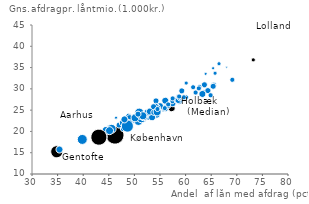
| Category | København Frederiksberg Ballerup Brøndby Dragør Gentofte Gladsaxe Glostrup Herlev Albertslund Hvidovre Høje-Taastrup Lyngby-Taarbæk Rødovre Ishøj Tårnby Vallensbæk Furesø Allerød Fredensborg Helsingør Hillerød Hørsholm Rudersdal Egedal Frederikssund Greve |
|---|---|
| 46.2064292720321 | 19.141 |
| 43.74948794481222 | 18.816 |
| 53.246990490733516 | 24.933 |
| 56.19966291986821 | 25.818 |
| 42.278254790851285 | 19.074 |
| 34.788096925415566 | 15.276 |
| 52.63663149727503 | 23.701 |
| 54.024108417019164 | 24.579 |
| 52.193446699924216 | 24.371 |
| 57.779519547929624 | 26.707 |
| 54.0351104898731 | 23.713 |
| 57.049739228572946 | 26.231 |
| 45.27730023196215 | 20.652 |
| 54.320895299980634 | 23.922 |
| 55.60501067124296 | 25.104 |
| 53.3598359484861 | 23.438 |
| 54.845332667704824 | 25.705 |
| 48.10721754639332 | 22.326 |
| 50.54379972469607 | 23.61 |
| 47.89460088870281 | 22.057 |
| 44.46162168246338 | 20.262 |
| 51.582018004327864 | 24.283 |
| 35.30276949004437 | 15.828 |
| 39.759261127122656 | 18.192 |
| 52.32371686442673 | 24.364 |
| 55.89909777880659 | 25.564 |
| 49.562023551926856 | 22.693 |
| 54.971494579143624 | 25.966 |
| 59.51351144801025 | 28.023 |
| 50.77179942301091 | 22.483 |
| 46.92196700817854 | 21.583 |
| 51.198463640133575 | 24.346 |
| 58.62182826427579 | 28.041 |
| 57.260782543468416 | 25.477 |
| 63.57810084550412 | 29.248 |
| 64.30551935380483 | 29.652 |
| 60.04206838136897 | 28.056 |
| 63.21757992265047 | 28.872 |
| 59.576293238839604 | 28.116 |
| 64.81200376808351 | 28.586 |
| 57.41797664455086 | 26.609 |
| 73.20636326052782 | 36.827 |
| 58.579082050117606 | 27.424 |
| 65.45613209990967 | 30.909 |
| 65.30283014713947 | 30.693 |
| 69.0765077816254 | 32.183 |
| 48.83302188158715 | 23.635 |
| 57.421351933889284 | 27.128 |
| 58.260995533210426 | 27.455 |
| 51.56843677412806 | 24.389 |
| 56.48934295783712 | 26.007 |
| 51.36271607670505 | 23.376 |
| 55.9412249982676 | 27.325 |
| 57.40356821032581 | 27.832 |
| 65.33784431188377 | 34.894 |
| 67.99148653082466 | 35.123 |
| 58.478276799627324 | 27.36 |
| 60.09019253114474 | 31.396 |
| 63.66540245751845 | 30.964 |
| 66.49705164716238 | 35.936 |
| 50.85447798962824 | 24.543 |
| 46.36073431643357 | 23.278 |
| 54.217786722803794 | 27.173 |
| 61.903809665884694 | 29.196 |
| 62.70012262752645 | 30.429 |
| 49.022658465816434 | 23.3 |
| 51.715606526291204 | 23.528 |
| 50.097864136057304 | 23.225 |
| 54.15818674029197 | 25.563 |
| 52.95755835770892 | 24.756 |
| 53.786334620347084 | 24.489 |
| 65.66472716568359 | 33.787 |
| 58.778095478747694 | 27.865 |
| 47.676519258747646 | 22.067 |
| 56.5601855533032 | 26.383 |
| 51.163932861536246 | 23.747 |
| 47.69121677824516 | 20.636 |
| 51.583861064522395 | 23.755 |
| 45.47538905157594 | 20.697 |
| 53.793351055240365 | 25.349 |
| 45.103201570543 | 20.235 |
| 43.03830773880211 | 18.679 |
| 54.105100966985866 | 26.115 |
| 59.221749063148344 | 29.561 |
| 53.707653597427594 | 25.844 |
| 63.897664786075794 | 33.55 |
| 61.44330576227153 | 30.418 |
| 62.574588597347194 | 30.131 |
| 54.369944552055735 | 24.661 |
| 55.87042714014425 | 25.541 |
| 48.93576999474889 | 22.036 |
| 58.772610228909016 | 27.862 |
| 58.914011183173734 | 27.687 |
| 54.45012158883824 | 25.329 |
| 58.71876776956309 | 28.229 |
| 50.66452132233672 | 24.108 |
| 48.56824541373231 | 21.327 |
| 48.00553140459267 | 22.882 |